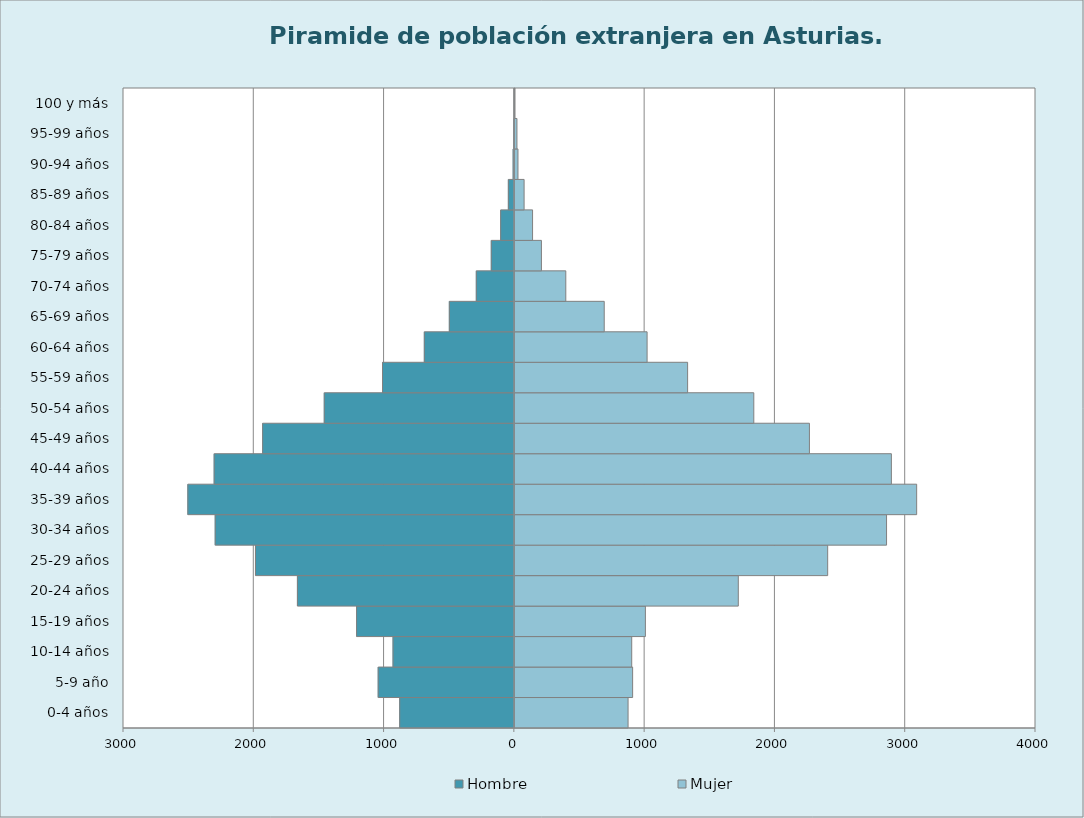
| Category | Hombre | Mujer |
|---|---|---|
| 0-4 años | -880 | 869 |
| 5-9 año | -1045 | 904 |
| 10-14 años | -931 | 897 |
| 15-19 años | -1211 | 1002 |
| 20-24 años | -1665 | 1715 |
| 25-29 años | -1987 | 2401 |
| 30-34 años | -2296 | 2853 |
| 35-39 años | -2506 | 3084 |
| 40-44 años | -2304 | 2890 |
| 45-49 años | -1932 | 2261 |
| 50-54 años | -1459 | 1834 |
| 55-59 años | -1012 | 1326 |
| 60-64 años | -691 | 1015 |
| 65-69 años | -499 | 686 |
| 70-74 años | -292 | 391 |
| 75-79 años | -177 | 204 |
| 80-84 años | -105 | 136 |
| 85-89 años | -46 | 71 |
| 90-94 años | -9 | 24 |
| 95-99 años | -3 | 16 |
| 100 y más | 0 | 1 |